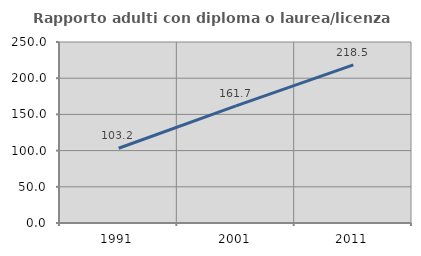
| Category | Rapporto adulti con diploma o laurea/licenza media  |
|---|---|
| 1991.0 | 103.226 |
| 2001.0 | 161.722 |
| 2011.0 | 218.506 |